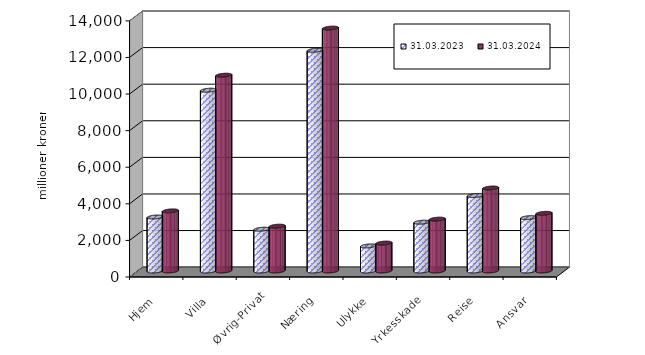
| Category | 31.03.2023 | 31.03.2024 |
|---|---|---|
| Hjem | 2952.099 | 3285.926 |
| Villa | 9883.164 | 10701.558 |
| Øvrig-Privat | 2284.698 | 2450.437 |
| Næring | 12063.918 | 13276.853 |
| Ulykke | 1372.872 | 1526.23 |
| Yrkesskade | 2669.629 | 2835.015 |
| Reise | 4124.216 | 4535.626 |
| Ansvar | 2916.611 | 3152.361 |